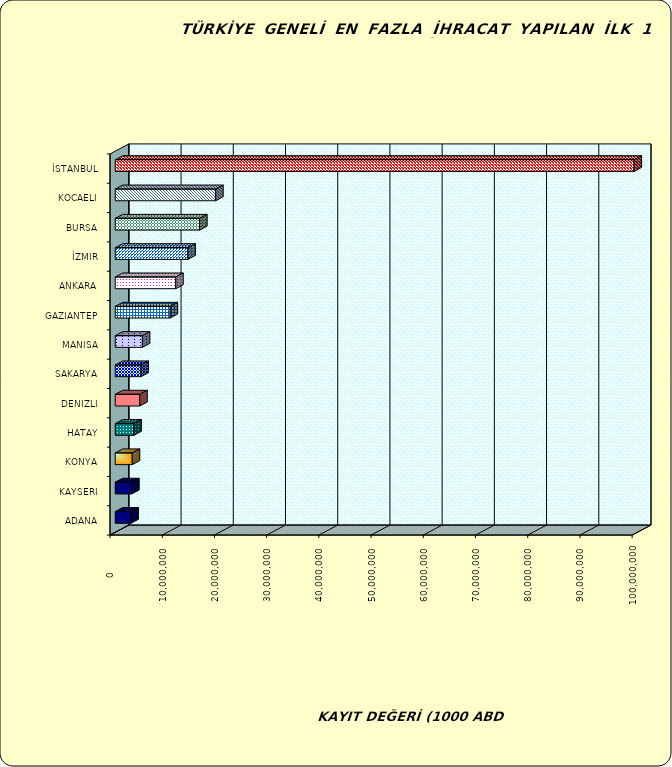
| Category | Series 0 |
|---|---|
| İSTANBUL | 99366195.54 |
| KOCAELI | 19238880.804 |
| BURSA | 16162737.597 |
| İZMIR | 13918814.456 |
| ANKARA | 11584298.13 |
| GAZIANTEP | 10523349.324 |
| MANISA | 5203084.272 |
| SAKARYA | 4930360.758 |
| DENIZLI | 4702475.778 |
| HATAY | 3564517.55 |
| KONYA | 3262160.587 |
| KAYSERI | 3145420.793 |
| ADANA | 3007916.631 |